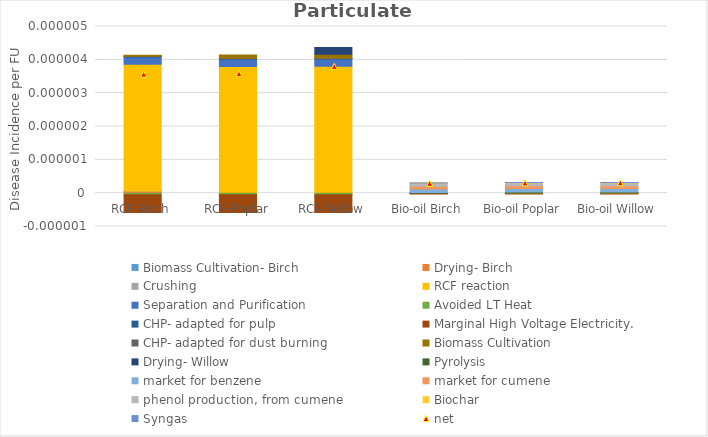
| Category | Biomass Cultivation- Birch | Drying- Birch | Crushing | RCF reaction | Separation and Purification | Avoided LT Heat  | CHP- adapted for pulp | Marginal High Voltage Electricity.  | CHP- adapted for dust burning | Biomass Cultivation | Drying- Willow | Pyrolysis | market for benzene | market for cumene | phenol production, from cumene | Biochar | Syngas |
|---|---|---|---|---|---|---|---|---|---|---|---|---|---|---|---|---|---|
| RCF-Birch | 0 | 0 | 0 | 0 | 0 | 0 | 0 | 0 | 0 | 0 | 0 | 0 | 0 | 0 | 0 | 0 | 0 |
| RCF-Poplar | 0 | 0 | 0 | 0 | 0 | 0 | 0 | 0 | 0 | 0 | 0 | 0 | 0 | 0 | 0 | 0 | 0 |
| RCF-Willow | 0 | 0 | 0 | 0 | 0 | 0 | 0 | 0 | 0 | 0 | 0 | 0 | 0 | 0 | 0 | 0 | 0 |
| Bio-oil Birch | 0 | 0 | 0 | 0 | 0 | 0 | 0 | 0 | 0 | 0 | 0 | 0 | 0 | 0 | 0 | 0 | 0 |
| Bio-oil Poplar | 0 | 0 | 0 | 0 | 0 | 0 | 0 | 0 | 0 | 0 | 0 | 0 | 0 | 0 | 0 | 0 | 0 |
| Bio-oil Willow | 0 | 0 | 0 | 0 | 0 | 0 | 0 | 0 | 0 | 0 | 0 | 0 | 0 | 0 | 0 | 0 | 0 |